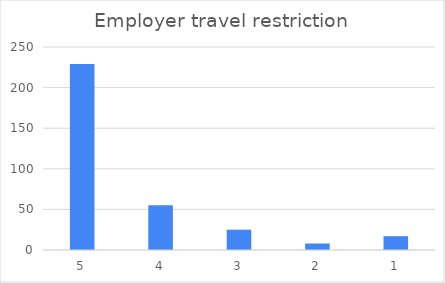
| Category | Series 0 |
|---|---|
| 5 | 229 |
| 4 | 55 |
| 3 | 25 |
| 2 | 8 |
| 1 | 17 |